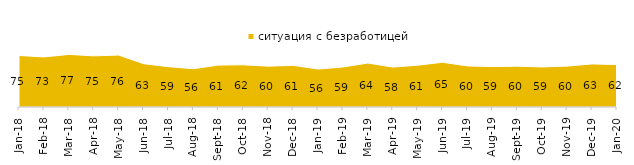
| Category | ситуация с безработицей |
|---|---|
| 2018-01-01 | 75.4 |
| 2018-02-01 | 73.25 |
| 2018-03-01 | 76.95 |
| 2018-04-01 | 74.85 |
| 2018-05-01 | 76 |
| 2018-06-01 | 63.4 |
| 2018-07-01 | 59 |
| 2018-08-01 | 56 |
| 2018-09-01 | 61.35 |
| 2018-10-01 | 61.75 |
| 2018-11-01 | 59.78 |
| 2018-12-01 | 60.95 |
| 2019-01-01 | 55.55 |
| 2019-02-01 | 58.5 |
| 2019-03-01 | 64.296 |
| 2019-04-01 | 58.416 |
| 2019-05-01 | 61.169 |
| 2019-06-01 | 65.436 |
| 2019-07-01 | 60.099 |
| 2019-08-01 | 59.241 |
| 2019-09-01 | 59.703 |
| 2019-10-01 | 58.614 |
| 2019-11-01 | 59.851 |
| 2019-12-01 | 63.02 |
| 2020-01-01 | 62.129 |